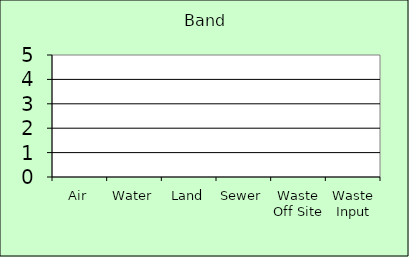
| Category | Band |
|---|---|
| Air | 0 |
| Water | 0 |
| Land | 0 |
| Sewer | 0 |
| Waste Off Site | 0 |
| Waste Input | 0 |